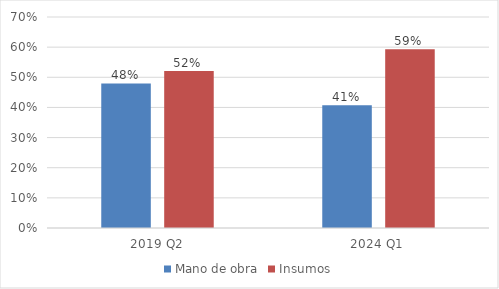
| Category | Mano de obra | Insumos |
|---|---|---|
| 2019 Q2 | 0.479 | 0.521 |
| 2024 Q1 | 0.407 | 0.593 |